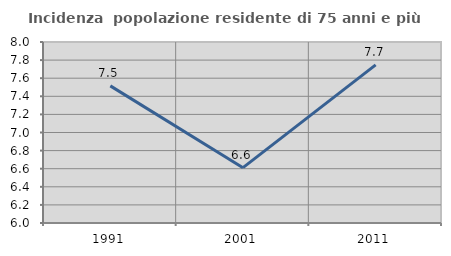
| Category | Incidenza  popolazione residente di 75 anni e più |
|---|---|
| 1991.0 | 7.515 |
| 2001.0 | 6.612 |
| 2011.0 | 7.747 |